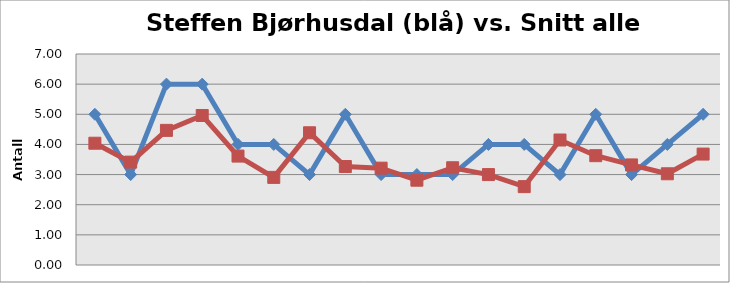
| Category | Steffen Bjørhusdal | Snitt alle totalt |
|---|---|---|
| Snitt hull 1 | 5 | 4.04 |
| Snitt hull 2 | 3 | 3.413 |
| Snitt hull 3 | 6 | 4.467 |
| Snitt hull 4 | 6 | 4.96 |
| Snitt hull 5 | 4 | 3.613 |
| Snitt hull 6 | 4 | 2.907 |
| Snitt hull 7 | 3 | 4.387 |
| Snitt hull 8 | 5 | 3.267 |
| Snitt hull 9 | 3 | 3.213 |
| Snitt hull 10 | 3 | 2.813 |
| Snitt hull 11 | 3 | 3.227 |
| Snitt hull 12 | 4 | 3 |
| Snitt hull 13 | 4 | 2.6 |
| Snitt hull 14 | 3 | 4.147 |
| Snitt hull 15 | 5 | 3.627 |
| Snitt hull 16 | 3 | 3.32 |
| Snitt hull 17 | 4 | 3.027 |
| Snitt hull 18 | 5 | 3.68 |